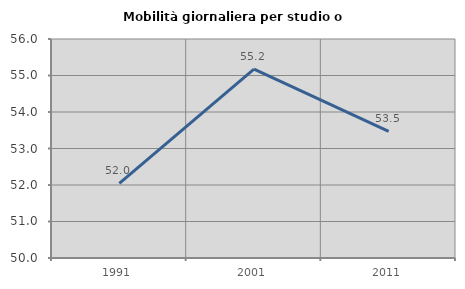
| Category | Mobilità giornaliera per studio o lavoro |
|---|---|
| 1991.0 | 52.042 |
| 2001.0 | 55.176 |
| 2011.0 | 53.468 |